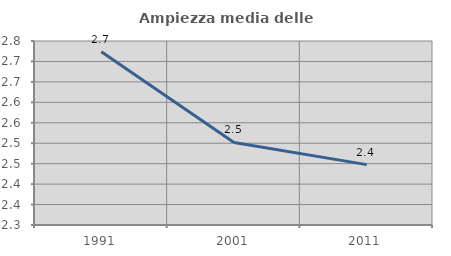
| Category | Ampiezza media delle famiglie |
|---|---|
| 1991.0 | 2.724 |
| 2001.0 | 2.502 |
| 2011.0 | 2.448 |